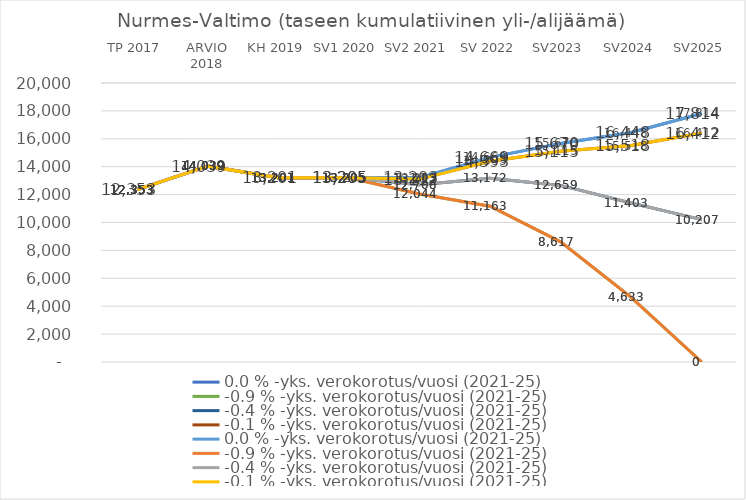
| Category | 0,0 % | -0,9 % | -0,4 % | -0,1 % |
|---|---|---|---|---|
| TP 2017 | 12353 | 12353 | 12353 | 12353 |
| ARVIO 2018 | 14039.303 | 14039.303 | 14039.303 | 14039.303 |
| KH 2019 | 13200.629 | 13200.629 | 13200.629 | 13200.629 |
| SV1 2020 | 13204.793 | 13204.793 | 13204.793 | 13204.793 |
| SV2 2021 | 13203.26 | 12043.869 | 12708.178 | 13112.032 |
| SV 2022 | 14669.269 | 11162.642 | 13171.872 | 14393.347 |
| SV2023 | 15670.255 | 8617.378 | 12658.54 | 15115.292 |
| SV2024 | 16447.995 | 4632.695 | 11402.634 | 15518.297 |
| SV2025 | 17813.808 | 0 | 10206.968 | 16412.111 |